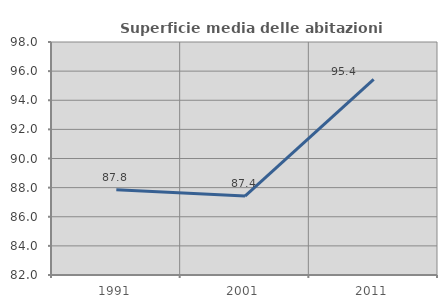
| Category | Superficie media delle abitazioni occupate |
|---|---|
| 1991.0 | 87.847 |
| 2001.0 | 87.421 |
| 2011.0 | 95.426 |